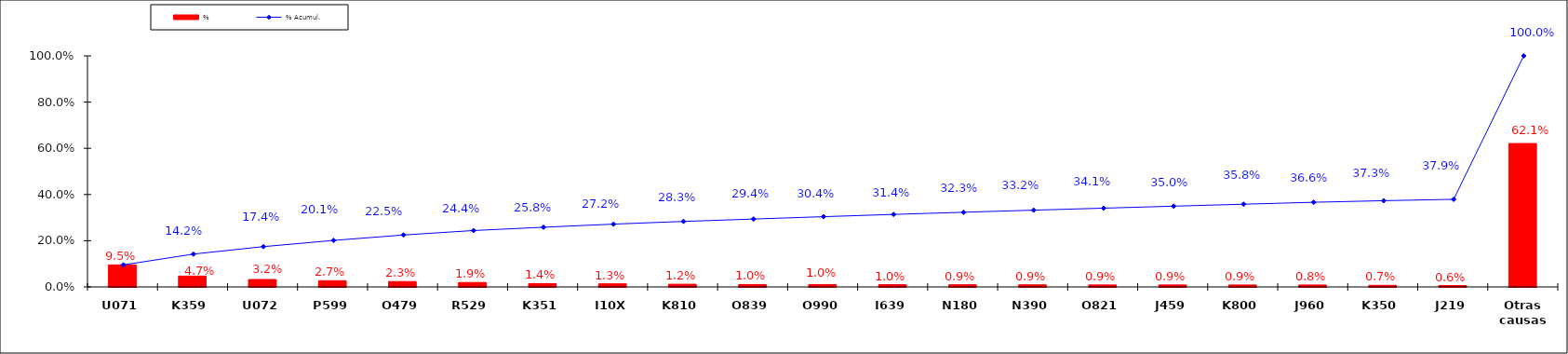
| Category | % |
|---|---|
| U071 | 0.095 |
| K359 | 0.047 |
| U072 | 0.032 |
| P599 | 0.027 |
| O479 | 0.023 |
| R529 | 0.019 |
| K351 | 0.014 |
| I10X | 0.013 |
| K810 | 0.012 |
| O839 | 0.01 |
| O990 | 0.01 |
| I639 | 0.01 |
| N180 | 0.009 |
| N390 | 0.009 |
| O821 | 0.009 |
| J459 | 0.009 |
| K800 | 0.009 |
| J960 | 0.008 |
| K350 | 0.007 |
| J219 | 0.006 |
| Otras causas | 0.621 |